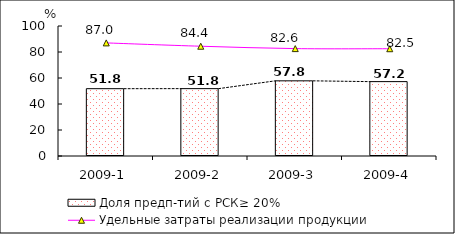
| Category | Доля предп-тий с РСК≥ 20% |
|---|---|
| 2009-1 | 51.784 |
| 2009-2 | 51.826 |
| 2009-3 | 57.816 |
| 2009-4 | 57.213 |